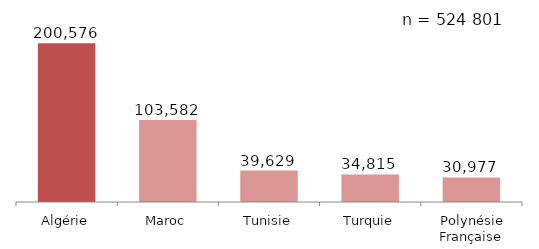
| Category | Series 0 |
|---|---|
| Algérie | 200576 |
| Maroc | 103582 |
| Tunisie | 39629 |
| Turquie | 34815 |
| Polynésie Française | 30977 |